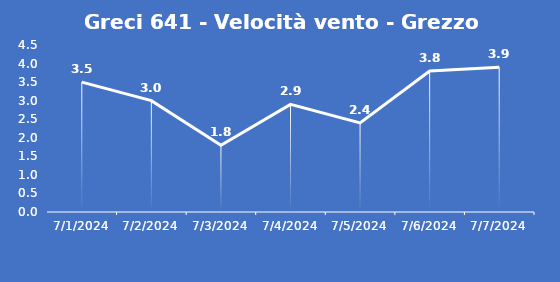
| Category | Greci 641 - Velocità vento - Grezzo (m/s) |
|---|---|
| 7/1/24 | 3.5 |
| 7/2/24 | 3 |
| 7/3/24 | 1.8 |
| 7/4/24 | 2.9 |
| 7/5/24 | 2.4 |
| 7/6/24 | 3.8 |
| 7/7/24 | 3.9 |